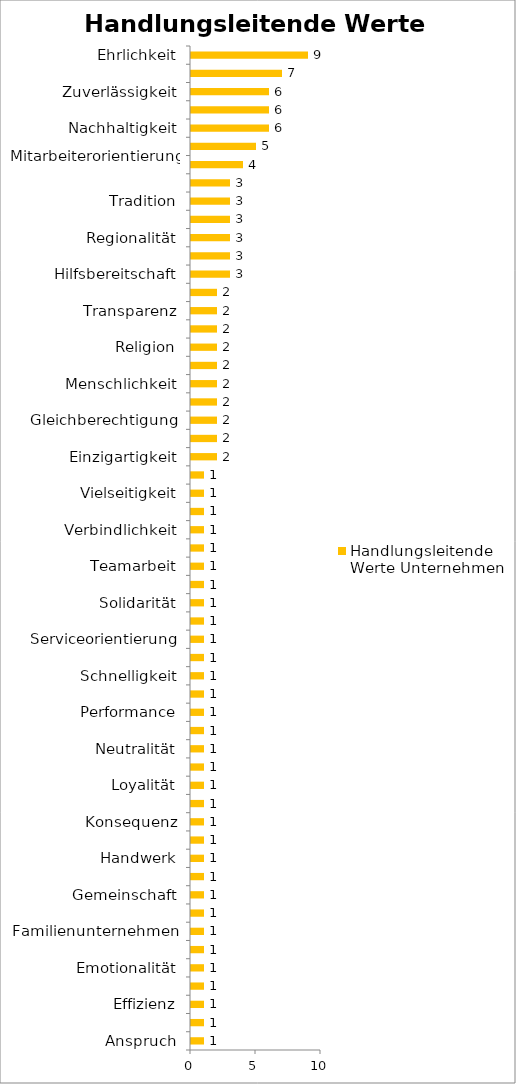
| Category | Handlungsleitende Werte Unternehmen |
|---|---|
| Anspruch | 1 |
| Authentizität | 1 |
| Effizienz | 1 |
| Einheitlichkeit | 1 |
| Emotionalität | 1 |
| Erfolg | 1 |
| Familienunternehmen | 1 |
| Flexibilität | 1 |
| Gemeinschaft | 1 |
| Gewissenhaftigkeit | 1 |
| Handwerk | 1 |
| Kompetenz | 1 |
| Konsequenz | 1 |
| Kontinuität | 1 |
| Loyalität | 1 |
| Nähe | 1 |
| Neutralität | 1 |
| Objektivität | 1 |
| Performance | 1 |
| Präsenz | 1 |
| Schnelligkeit | 1 |
| Seriosität | 1 |
| Serviceorientierung | 1 |
| Sicherheit | 1 |
| Solidarität | 1 |
| Spaß | 1 |
| Teamarbeit | 1 |
| Unabhängigkeit | 1 |
| Verbindlichkeit | 1 |
| Vertraulichkeit | 1 |
| Vielseitigkeit | 1 |
| Zuwendungsfähigkeit | 1 |
| Einzigartigkeit | 2 |
| Freundlichkeit | 2 |
| Gleichberechtigung | 2 |
| Kundenorientierung | 2 |
| Menschlichkeit | 2 |
| Offenheit | 2 |
| Religion | 2 |
| Sauberkeit | 2 |
| Transparenz | 2 |
| Verantwortung | 2 |
| Hilfsbereitschaft | 3 |
| Pünktlichkeit | 3 |
| Regionalität | 3 |
| Toleranz | 3 |
| Tradition | 3 |
| Wertschätzung | 3 |
| Mitarbeiterorientierung | 4 |
| Qualität | 5 |
| Nachhaltigkeit | 6 |
| Respekt | 6 |
| Zuverlässigkeit | 6 |
| Vertrauen | 7 |
| Ehrlichkeit | 9 |